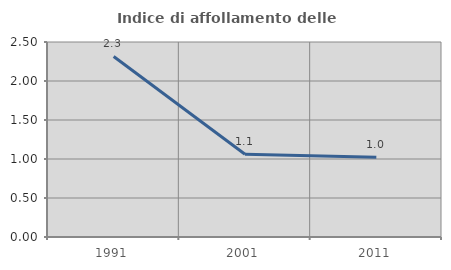
| Category | Indice di affollamento delle abitazioni  |
|---|---|
| 1991.0 | 2.315 |
| 2001.0 | 1.06 |
| 2011.0 | 1.021 |